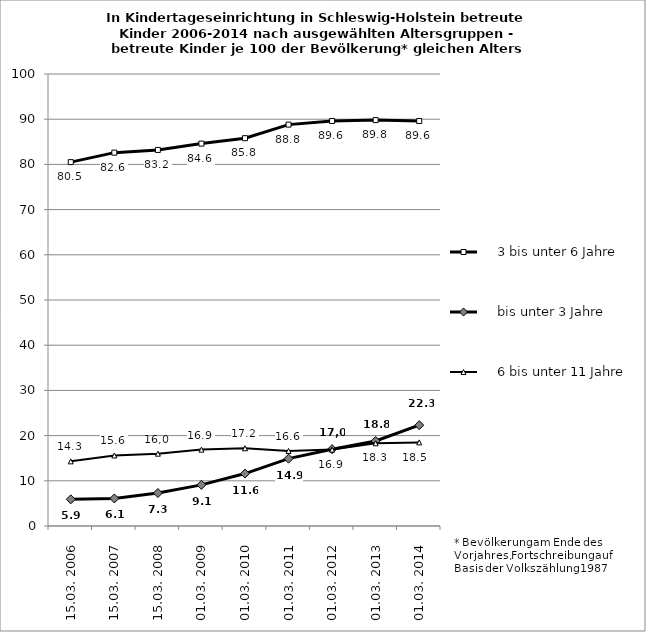
| Category |     3 bis unter 6 Jahre |     bis unter 3 Jahre |     6 bis unter 11 Jahre |
|---|---|---|---|
| 15.03. 2006 | 80.5 | 5.9 | 14.3 |
| 15.03. 2007 | 82.6 | 6.1 | 15.6 |
| 15.03. 2008 | 83.2 | 7.3 | 16 |
| 01.03. 2009 | 84.6 | 9.1 | 16.9 |
| 01.03. 2010 | 85.8 | 11.6 | 17.2 |
| 01.03. 2011 | 88.8 | 14.9 | 16.6 |
| 01.03. 2012 | 89.6 | 17 | 16.9 |
| 01.03. 2013 | 89.8 | 18.8 | 18.3 |
| 01.03. 2014 | 89.6 | 22.3 | 18.5 |